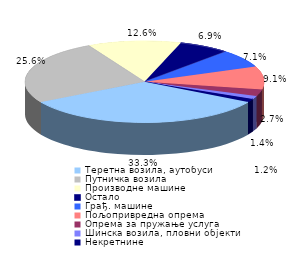
| Category | Series 0 |
|---|---|
| Теретна возила, аутобуси | 0.333 |
| Путничка возила | 0.256 |
| Производне машине | 0.126 |
| Остало | 0.069 |
| Грађ. машине | 0.071 |
| Пољопривредна опрема | 0.091 |
| Опрема за пружање услуга | 0.027 |
| Шинска возила, пловни oбјекти | 0.012 |
| Некретнине | 0.014 |